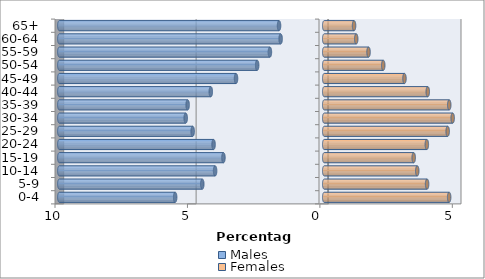
| Category | Males | Females |
|---|---|---|
| 0-4 | -5.628 | 4.717 |
| 5-9 | -4.604 | 3.883 |
| 10-14 | -4.119 | 3.512 |
| 15-19 | -3.805 | 3.378 |
| 20-24 | -4.178 | 3.874 |
| 25-29 | -4.966 | 4.661 |
| 30-34 | -5.229 | 4.849 |
| 35-39 | -5.157 | 4.72 |
| 40-44 | -4.282 | 3.909 |
| 45-49 | -3.33 | 3.03 |
| 50-54 | -2.532 | 2.228 |
| 55-59 | -2.05 | 1.673 |
| 60-64 | -1.646 | 1.208 |
| 65+ | -1.706 | 1.126 |